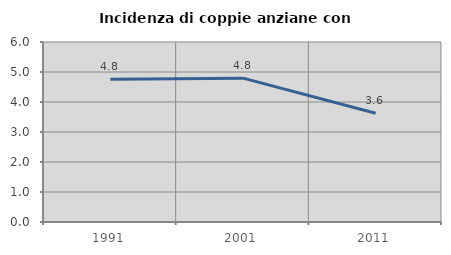
| Category | Incidenza di coppie anziane con figli |
|---|---|
| 1991.0 | 4.762 |
| 2001.0 | 4.795 |
| 2011.0 | 3.623 |